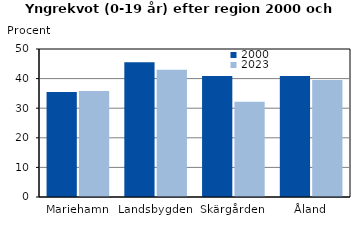
| Category | 2000 | 2023 |
|---|---|---|
| Mariehamn | 35.463 | 35.798 |
| Landsbygden | 45.524 | 43.001 |
| Skärgården | 40.92 | 32.139 |
| Åland | 40.872 | 39.542 |